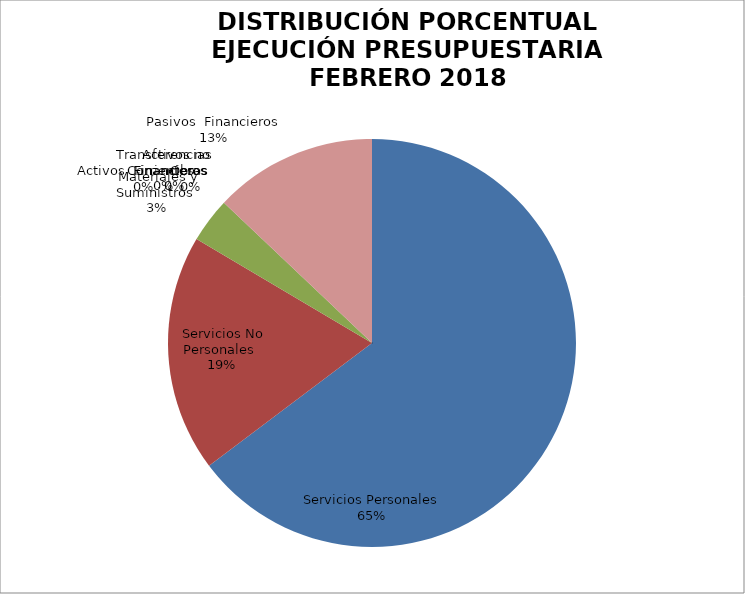
| Category | Series 0 | Series 1 |
|---|---|---|
| Servicios Personales | 11120969.29 | 0.647 |
| Servicios No Personales | 3228783.27 | 0.188 |
| Materiales y Suministros | 610816.97 | 0.036 |
| Transferencias Corrientes | 0 | 0 |
| Activos no Financieros | 0 | 0 |
| Obras | 0 | 0 |
| Activos  Financieros | 0 | 0 |
| Pasivos  Financieros | 2221468.34 | 0.129 |